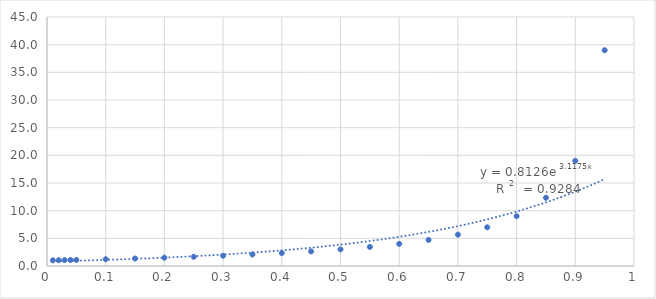
| Category | Series 0 |
|---|---|
| 0.01 | 1.02 |
| 0.02 | 1.041 |
| 0.03 | 1.062 |
| 0.04 | 1.083 |
| 0.05 | 1.105 |
| 0.1 | 1.222 |
| 0.15000000000000002 | 1.353 |
| 0.2 | 1.5 |
| 0.25 | 1.667 |
| 0.3 | 1.857 |
| 0.35 | 2.077 |
| 0.39999999999999997 | 2.333 |
| 0.44999999999999996 | 2.636 |
| 0.49999999999999994 | 3 |
| 0.5499999999999999 | 3.444 |
| 0.6 | 4 |
| 0.65 | 4.714 |
| 0.7000000000000001 | 5.667 |
| 0.7500000000000001 | 7 |
| 0.8000000000000002 | 9 |
| 0.8500000000000002 | 12.333 |
| 0.9000000000000002 | 19 |
| 0.9500000000000003 | 39 |